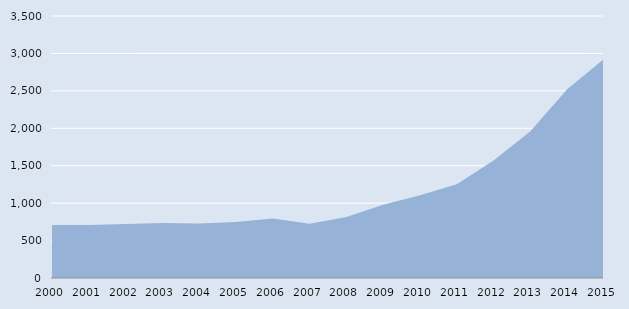
| Category | Series 0 |
|---|---|
| 2000.0 | 708 |
| 2001.0 | 709 |
| 2002.0 | 721 |
| 2003.0 | 735 |
| 2004.0 | 728 |
| 2005.0 | 748 |
| 2006.0 | 794 |
| 2007.0 | 724 |
| 2008.0 | 814 |
| 2009.0 | 979 |
| 2010.0 | 1107 |
| 2011.0 | 1251 |
| 2012.0 | 1571 |
| 2013.0 | 1962 |
| 2014.0 | 2523 |
| 2015.0 | 2925 |